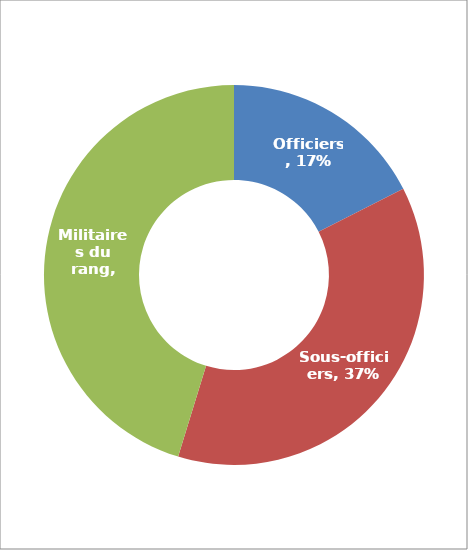
| Category | Series 0 |
|---|---|
| Officiers | 0.175 |
| Sous-officiers | 0.373 |
| Militaires du rang | 0.453 |